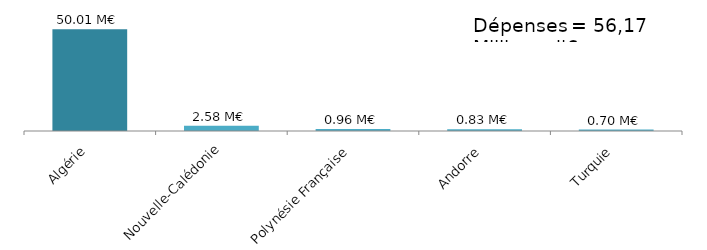
| Category | Series 0 |
|---|---|
| Algérie | 50008521.24 |
| Nouvelle-Calédonie | 2575937.68 |
| Polynésie Française | 956480.12 |
| Andorre | 832118.28 |
| Turquie | 695873.98 |